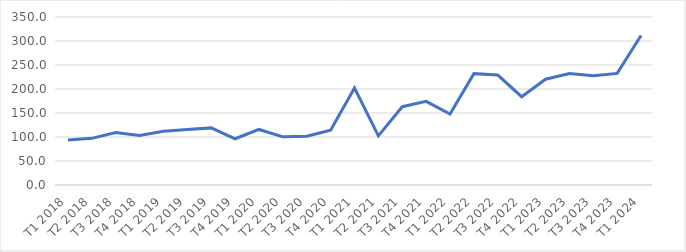
| Category | Series 0 |
|---|---|
| T1 2018 | 93.693 |
| T2 2018 | 97.192 |
| T3 2018 | 109.53 |
| T4 2018 | 102.968 |
| T1 2019 | 111.972 |
| T2 2019 | 115.674 |
| T3 2019 | 119.003 |
| T4 2019 | 96.336 |
| T1 2020 | 115.742 |
| T2 2020 | 100.317 |
| T3 2020 | 101.44 |
| T4 2020 | 114.197 |
| T1 2021 | 202.112 |
| T2 2021 | 102.35 |
| T3 2021 | 163.166 |
| T4 2021 | 174.299 |
| T1 2022 | 147.791 |
| T2 2022 | 232.025 |
| T3 2022 | 229.042 |
| T4 2022 | 183.964 |
| T1 2023 | 220.427 |
| T2 2023 | 232.025 |
| T3 2023 | 227.382 |
| T4 2023 | 232.454 |
| T1 2024 | 311.496 |